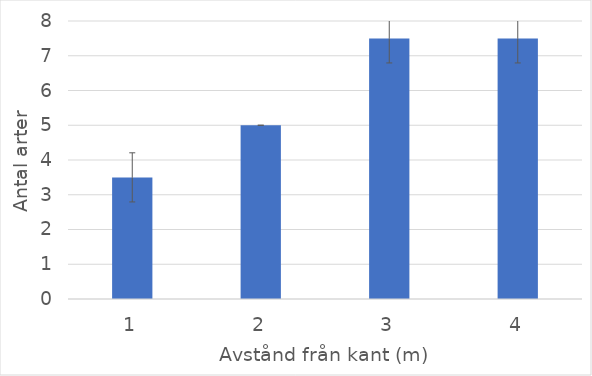
| Category | Series 0 |
|---|---|
| 0 | 3.5 |
| 1 | 5 |
| 2 | 7.5 |
| 3 | 7.5 |